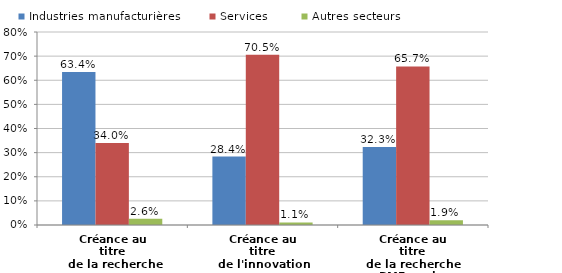
| Category | Industries manufacturières | Services | Autres secteurs |
|---|---|---|---|
| Créance au titre
 de la recherche | 0.634 | 0.34 | 0.026 |
| Créance au titre
de l'innovation | 0.284 | 0.705 | 0.011 |
| Créance au titre
de la recherche
PME seules | 0.323 | 0.657 | 0.019 |